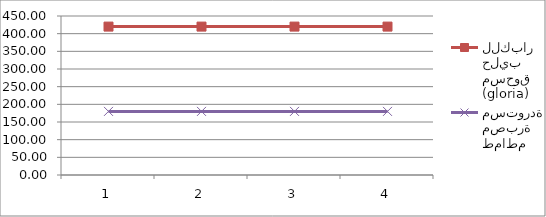
| Category | (gloria) مسحوق حليب للكبار | طماطم مصبرة مستوردة |
|---|---|---|
| 0 | 420 | 180 |
| 1 | 420 | 180 |
| 2 | 420 | 180 |
| 3 | 420 | 180 |